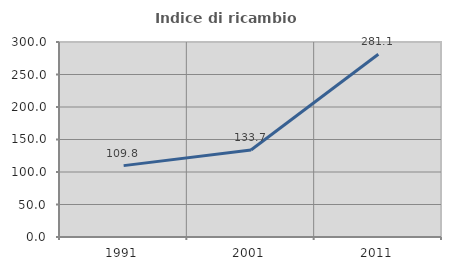
| Category | Indice di ricambio occupazionale  |
|---|---|
| 1991.0 | 109.824 |
| 2001.0 | 133.748 |
| 2011.0 | 281.073 |